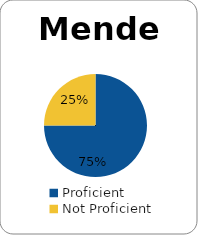
| Category | Series 0 |
|---|---|
| Proficient | 0.75 |
| Not Proficient | 0.25 |